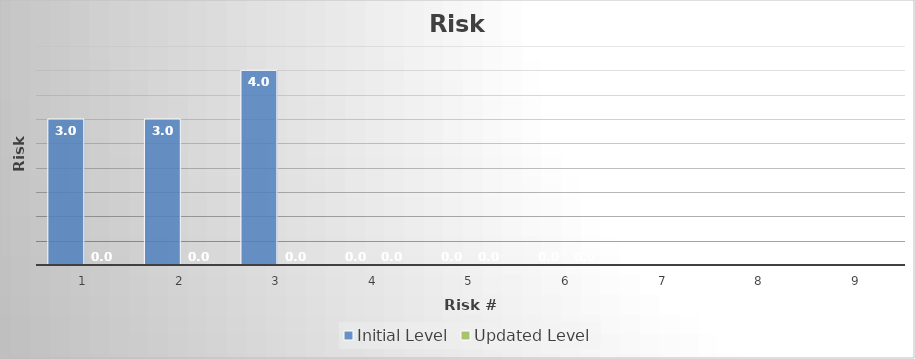
| Category | Initial Level | Updated Level |
|---|---|---|
| 0 | 3 | 0 |
| 1 | 3 | 0 |
| 2 | 4 | 0 |
| 3 | 0 | 0 |
| 4 | 0 | 0 |
| 5 | 0 | 0 |
| 6 | 0 | 0 |
| 7 | 0 | 0 |
| 8 | 0 | 0 |